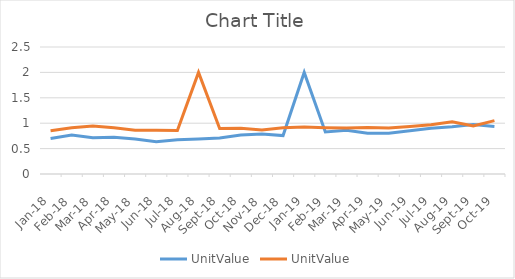
| Category | UnitValue |
|---|---|
| 2018-01-01 | 0.85 |
| 2018-02-01 | 0.91 |
| 2018-03-01 | 0.946 |
| 2018-04-01 | 0.911 |
| 2018-05-01 | 0.859 |
| 2018-06-01 | 0.861 |
| 2018-07-01 | 0.855 |
| 2018-08-01 | 2 |
| 2018-09-01 | 0.895 |
| 2018-10-01 | 0.9 |
| 2018-11-01 | 0.866 |
| 2018-12-01 | 0.912 |
| 2019-01-01 | 0.924 |
| 2019-02-01 | 0.911 |
| 2019-03-01 | 0.905 |
| 2019-04-01 | 0.913 |
| 2019-05-01 | 0.907 |
| 2019-06-01 | 0.936 |
| 2019-07-01 | 0.968 |
| 2019-08-01 | 1.03 |
| 2019-09-01 | 0.947 |
| 2019-10-01 | 1.05 |